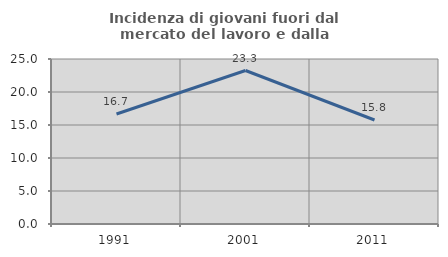
| Category | Incidenza di giovani fuori dal mercato del lavoro e dalla formazione  |
|---|---|
| 1991.0 | 16.667 |
| 2001.0 | 23.256 |
| 2011.0 | 15.758 |